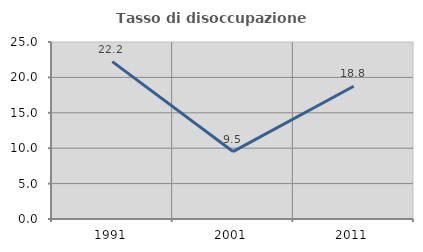
| Category | Tasso di disoccupazione giovanile  |
|---|---|
| 1991.0 | 22.222 |
| 2001.0 | 9.524 |
| 2011.0 | 18.75 |